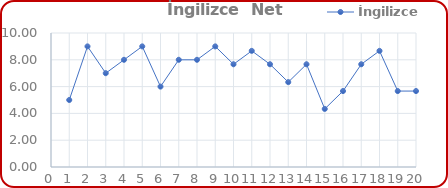
| Category | İngilizce |
|---|---|
| 0 | 5 |
| 1 | 9 |
| 2 | 7 |
| 3 | 8 |
| 4 | 9 |
| 5 | 6 |
| 6 | 8 |
| 7 | 8 |
| 8 | 9 |
| 9 | 7.667 |
| 10 | 8.667 |
| 11 | 7.667 |
| 12 | 6.333 |
| 13 | 7.667 |
| 14 | 4.333 |
| 15 | 5.667 |
| 16 | 7.667 |
| 17 | 8.667 |
| 18 | 5.667 |
| 19 | 5.667 |